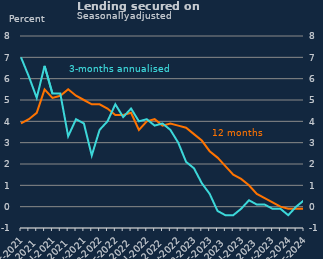
| Category | 12-month |
|---|---|
| Mar-2021 | 3.9 |
| Apr-2021 | 4.1 |
| May-2021 | 4.4 |
| Jun-2021 | 5.5 |
| Jul-2021 | 5.1 |
| Aug-2021 | 5.2 |
| Sep-2021 | 5.5 |
| Oct-2021 | 5.2 |
| Nov-2021 | 5 |
| Dec-2021 | 4.8 |
| Jan-2022 | 4.8 |
| Feb-2022 | 4.6 |
| Mar-2022 | 4.3 |
| Apr-2022 | 4.3 |
| May-2022 | 4.4 |
| Jun-2022 | 3.6 |
| Jul-2022 | 4 |
| Aug-2022 | 4.1 |
| Sep-2022 | 3.8 |
| Oct-2022 | 3.9 |
| Nov-2022 | 3.8 |
| Dec-2022 | 3.7 |
| Jan-2023 | 3.4 |
| Feb-2023 | 3.1 |
| Mar-2023 | 2.6 |
| Apr-2023 | 2.3 |
| May-2023 | 1.9 |
| Jun-2023 | 1.5 |
| Jul-2023 | 1.3 |
| Aug-2023 | 1 |
| Sep-2023 | 0.6 |
| Oct-2023 | 0.4 |
| Nov-2023 | 0.2 |
| Dec-2023 | 0 |
| Jan-2024 | -0.1 |
| Feb-2024 | -0.1 |
| Mar-2024 | -0.1 |